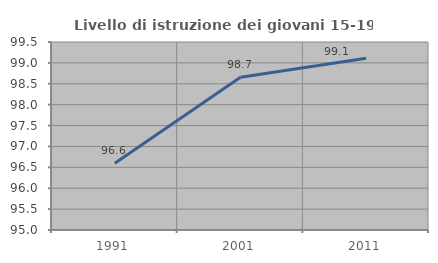
| Category | Livello di istruzione dei giovani 15-19 anni |
|---|---|
| 1991.0 | 96.599 |
| 2001.0 | 98.655 |
| 2011.0 | 99.111 |